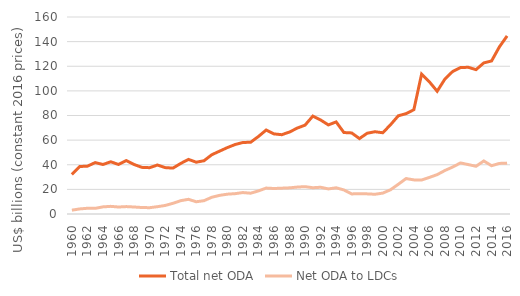
| Category | Total net ODA | Net ODA to LDCs |
|---|---|---|
| 1960.0 | 32.162 | 3.109 |
| 1961.0 | 38.552 | 4.122 |
| 1962.0 | 38.861 | 4.651 |
| 1963.0 | 41.75 | 4.584 |
| 1964.0 | 40.21 | 5.792 |
| 1965.0 | 42.426 | 6.212 |
| 1966.0 | 40.209 | 5.675 |
| 1967.0 | 43.421 | 6.016 |
| 1968.0 | 40.216 | 5.685 |
| 1969.0 | 37.884 | 5.267 |
| 1970.0 | 37.618 | 5.131 |
| 1971.0 | 39.77 | 5.933 |
| 1972.0 | 37.681 | 6.923 |
| 1973.0 | 37.275 | 8.674 |
| 1974.0 | 41.064 | 10.816 |
| 1975.0 | 44.349 | 11.932 |
| 1976.0 | 42.079 | 9.942 |
| 1977.0 | 43.261 | 10.813 |
| 1978.0 | 48.129 | 13.582 |
| 1979.0 | 51.045 | 15.131 |
| 1980.0 | 53.914 | 16.101 |
| 1981.0 | 56.423 | 16.523 |
| 1982.0 | 58.076 | 17.406 |
| 1983.0 | 58.275 | 16.889 |
| 1984.0 | 62.95 | 18.741 |
| 1985.0 | 68.212 | 21.062 |
| 1986.0 | 65.067 | 20.703 |
| 1987.0 | 64.403 | 20.977 |
| 1988.0 | 66.565 | 21.246 |
| 1989.0 | 69.781 | 21.861 |
| 1990.0 | 72.176 | 22.221 |
| 1991.0 | 79.51 | 21.336 |
| 1992.0 | 76.387 | 21.716 |
| 1993.0 | 72.346 | 20.372 |
| 1994.0 | 74.79 | 21.287 |
| 1995.0 | 66.169 | 19.535 |
| 1996.0 | 65.842 | 16.299 |
| 1997.0 | 61.258 | 16.533 |
| 1998.0 | 65.612 | 16.344 |
| 1999.0 | 66.814 | 16.034 |
| 2000.0 | 65.992 | 16.957 |
| 2001.0 | 72.492 | 19.681 |
| 2002.0 | 79.764 | 24.145 |
| 2003.0 | 81.508 | 28.79 |
| 2004.0 | 84.713 | 27.709 |
| 2005.0 | 113.691 | 27.602 |
| 2006.0 | 107.344 | 29.722 |
| 2007.0 | 99.694 | 31.974 |
| 2008.0 | 109.636 | 35.342 |
| 2009.0 | 115.78 | 38.164 |
| 2010.0 | 118.944 | 41.471 |
| 2011.0 | 119.153 | 40.142 |
| 2012.0 | 117.237 | 38.773 |
| 2013.0 | 122.735 | 43.071 |
| 2014.0 | 124.294 | 39.211 |
| 2015.0 | 135.672 | 41.076 |
| 2016.0 | 144.625 | 41.328 |